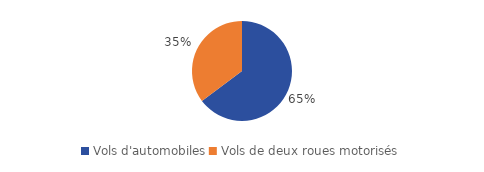
| Category | Series 0 |
|---|---|
| Vols d'automobiles | 89090 |
| Vols de deux roues motorisés | 48386 |